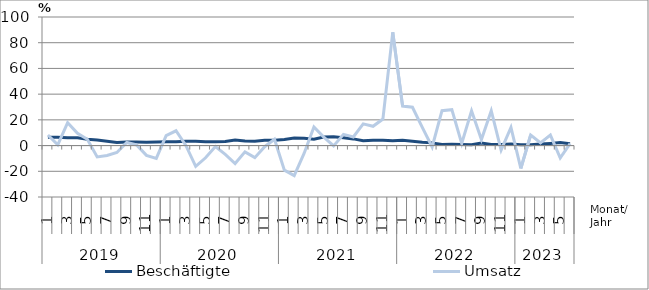
| Category | Beschäftigte | Umsatz |
|---|---|---|
| 0 | 6.4 | 8.2 |
| 1 | 6.5 | 0.6 |
| 2 | 6 | 17.8 |
| 3 | 6.1 | 9.6 |
| 4 | 4.9 | 4.9 |
| 5 | 4.3 | -8.8 |
| 6 | 3.3 | -7.7 |
| 7 | 2.4 | -5.4 |
| 8 | 2.8 | 2.4 |
| 9 | 2.7 | 0.5 |
| 10 | 2.5 | -7.6 |
| 11 | 2.7 | -10 |
| 12 | 2.9 | 7.8 |
| 13 | 2.9 | 11.5 |
| 14 | 3.4 | 0.1 |
| 15 | 3.4 | -16.1 |
| 16 | 2.9 | -9.5 |
| 17 | 2.9 | -0.8 |
| 18 | 3.1 | -6.9 |
| 19 | 4.3 | -14 |
| 20 | 3.6 | -4.9 |
| 21 | 3.4 | -9.4 |
| 22 | 4.1 | -0.9 |
| 23 | 4.1 | 4.9 |
| 24 | 4.8 | -19.1 |
| 25 | 5.8 | -23.3 |
| 26 | 5.6 | -6.1 |
| 27 | 5 | 14.4 |
| 28 | 6.6 | 6.6 |
| 29 | 6.9 | -0.3 |
| 30 | 6 | 8.7 |
| 31 | 5.2 | 6.7 |
| 32 | 3.8 | 16.9 |
| 33 | 4.2 | 15 |
| 34 | 4.2 | 20.6 |
| 35 | 3.7 | 88.1 |
| 36 | 4.1 | 30.7 |
| 37 | 3.4 | 29.8 |
| 38 | 2.6 | 14.1 |
| 39 | 2.1 | -1.1 |
| 40 | 0.9 | 27.1 |
| 41 | 1 | 27.9 |
| 42 | 0.8 | 1.7 |
| 43 | 0.7 | 27 |
| 44 | 2 | 4.7 |
| 45 | 0.9 | 27.1 |
| 46 | 0.9 | -3.5 |
| 47 | 1.2 | 14.1 |
| 48 | 0.6 | -17.8 |
| 49 | 0.6 | 8.2 |
| 50 | 1.2 | 2.1 |
| 51 | 1.7 | 8.2 |
| 52 | 2.3 | -9.6 |
| 53 | 1.5 | 1.5 |